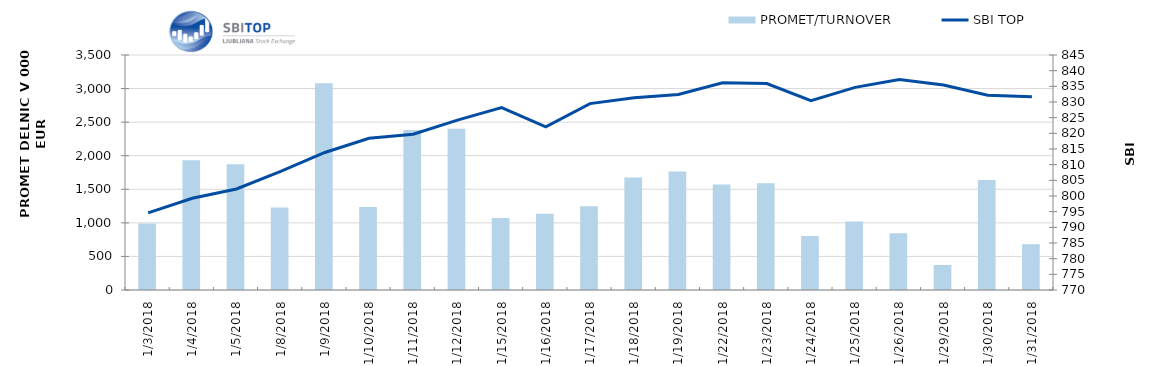
| Category | PROMET/TURNOVER |
|---|---|
| 1/3/18 | 989 |
| 1/4/18 | 1934 |
| 1/5/18 | 1873 |
| 1/8/18 | 1227 |
| 1/9/18 | 3079 |
| 1/10/18 | 1235 |
| 1/11/18 | 2383 |
| 1/12/18 | 2403 |
| 1/15/18 | 1071 |
| 1/16/18 | 1135 |
| 1/17/18 | 1246 |
| 1/18/18 | 1676 |
| 1/19/18 | 1765 |
| 1/22/18 | 1571 |
| 1/23/18 | 1591 |
| 1/24/18 | 803 |
| 1/25/18 | 1019 |
| 1/26/18 | 846 |
| 1/29/18 | 373 |
| 1/30/18 | 1640 |
| 1/31/18 | 682 |